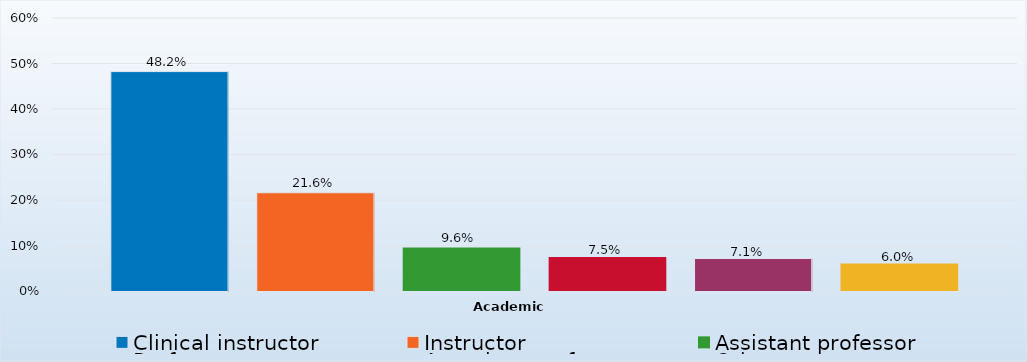
| Category | Clinical instructor | Instructor | Assistant professor | Professor | Associate professor | Other |
|---|---|---|---|---|---|---|
| 0 | 0.482 | 0.216 | 0.096 | 0.075 | 0.071 | 0.06 |